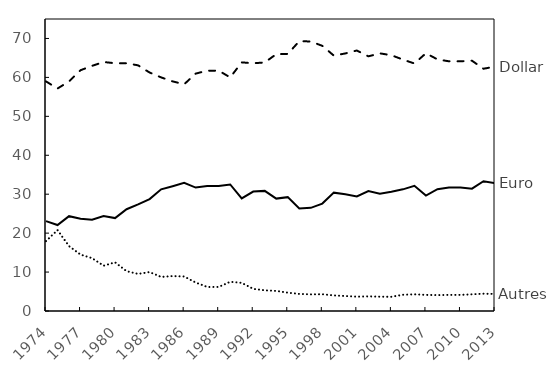
| Category | Dollar | Euro | Autres |
|---|---|---|---|
| 1974.0 | 58.974 | 23.077 | 17.949 |
| 1975.0 | 57.143 | 22.078 | 20.779 |
| 1976.0 | 58.974 | 24.359 | 16.667 |
| 1977.0 | 61.842 | 23.684 | 14.474 |
| 1978.0 | 62.963 | 23.457 | 13.58 |
| 1979.0 | 63.953 | 24.419 | 11.628 |
| 1980.0 | 63.636 | 23.864 | 12.5 |
| 1981.0 | 63.636 | 26.136 | 10.227 |
| 1982.0 | 63.095 | 27.381 | 9.524 |
| 1983.0 | 61.25 | 28.75 | 10 |
| 1984.0 | 60 | 31.25 | 8.75 |
| 1985.0 | 58.974 | 32.051 | 8.974 |
| 1986.0 | 58.228 | 32.911 | 8.861 |
| 1987.0 | 60.976 | 31.707 | 7.317 |
| 1988.0 | 61.728 | 32.099 | 6.173 |
| 1989.0 | 61.728 | 32.099 | 6.173 |
| 1990.0 | 60 | 32.5 | 7.5 |
| 1991.0 | 63.855 | 28.916 | 7.229 |
| 1992.0 | 63.636 | 30.682 | 5.682 |
| 1993.0 | 63.83 | 30.851 | 5.319 |
| 1994.0 | 65.979 | 28.866 | 5.155 |
| 1995.0 | 66.038 | 29.245 | 4.717 |
| 1996.0 | 69.298 | 26.316 | 4.386 |
| 1997.0 | 69.231 | 26.496 | 4.274 |
| 1998.0 | 68.103 | 27.586 | 4.31 |
| 1999.0 | 65.6 | 30.4 | 4 |
| 2000.0 | 66.154 | 30 | 3.846 |
| 2001.0 | 66.912 | 29.412 | 3.676 |
| 2002.0 | 65.414 | 30.827 | 3.759 |
| 2003.0 | 66.176 | 30.147 | 3.676 |
| 2004.0 | 65.693 | 30.657 | 3.65 |
| 2005.0 | 64.583 | 31.25 | 4.167 |
| 2006.0 | 63.571 | 32.143 | 4.286 |
| 2007.0 | 66.207 | 29.655 | 4.138 |
| 2008.0 | 64.626 | 31.293 | 4.082 |
| 2009.0 | 64.138 | 31.724 | 4.138 |
| 2010.0 | 64.138 | 31.724 | 4.138 |
| 2011.0 | 64.286 | 31.429 | 4.286 |
| 2012.0 | 62.222 | 33.333 | 4.444 |
| 2013.0 | 62.774 | 32.847 | 4.38 |